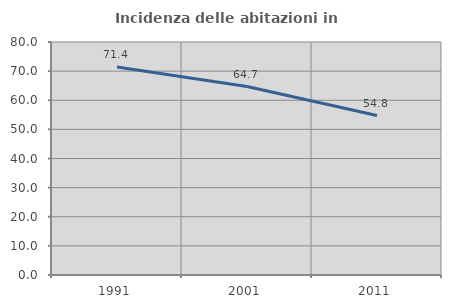
| Category | Incidenza delle abitazioni in proprietà  |
|---|---|
| 1991.0 | 71.429 |
| 2001.0 | 64.706 |
| 2011.0 | 54.762 |